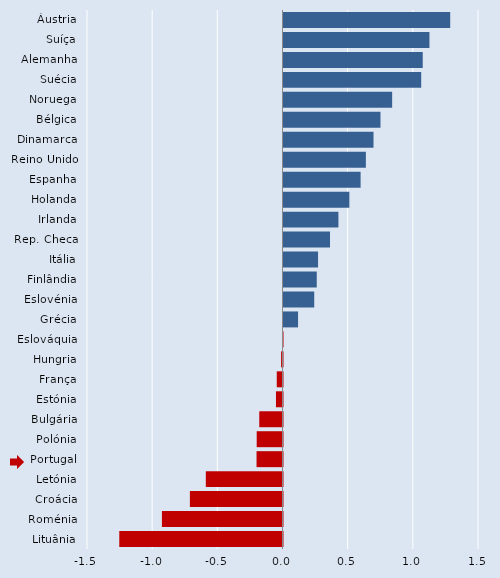
| Category | Series 0 |
|---|---|
| Áustria | 1.279 |
| Suíça | 1.12 |
| Alemanha | 1.068 |
| Suécia | 1.057 |
| Noruega | 0.834 |
| Bélgica | 0.744 |
| Dinamarca | 0.691 |
| Reino Unido | 0.632 |
| Espanha | 0.592 |
| Holanda | 0.505 |
| Irlanda | 0.421 |
| Rep. Checa | 0.357 |
| Itália | 0.265 |
| Finlândia | 0.255 |
| Eslovénia | 0.236 |
| Grécia | 0.112 |
| Eslováquia | -0.004 |
| Hungria | -0.011 |
| França | -0.044 |
| Estónia | -0.05 |
| Bulgária | -0.178 |
| Polónia | -0.198 |
| Portugal | -0.199 |
| Letónia | -0.588 |
| Croácia | -0.711 |
| Roménia | -0.925 |
| Lituânia | -1.252 |